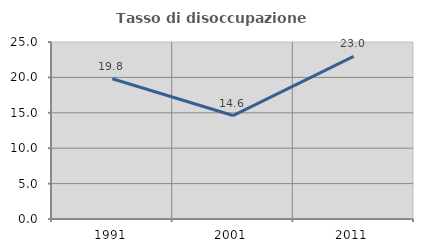
| Category | Tasso di disoccupazione giovanile  |
|---|---|
| 1991.0 | 19.817 |
| 2001.0 | 14.611 |
| 2011.0 | 22.959 |